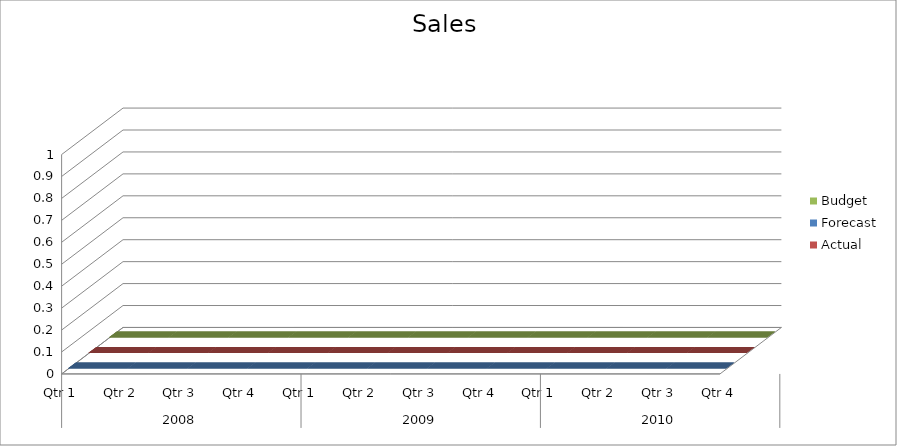
| Category | Budget | Forecast | Actual |
|---|---|---|---|
| 0 | 3090 | 2030 | 2620 |
| 1 | 1180 | 3380 | 1210 |
| 2 | 1280 | 1060 | 600 |
| 3 | 2340 | 2220 | 2830 |
| 4 | 600 | 1770 | 920 |
| 5 | 2170 | 1440 | 1610 |
| 6 | 690 | 2970 | 3010 |
| 7 | 3260 | 1740 | 3190 |
| 8 | 2770 | 1850 | 2890 |
| 9 | 2810 | 2860 | 2500 |
| 10 | 1270 | 2160 | 2680 |
| 11 | 1730 | 1260 | 3400 |